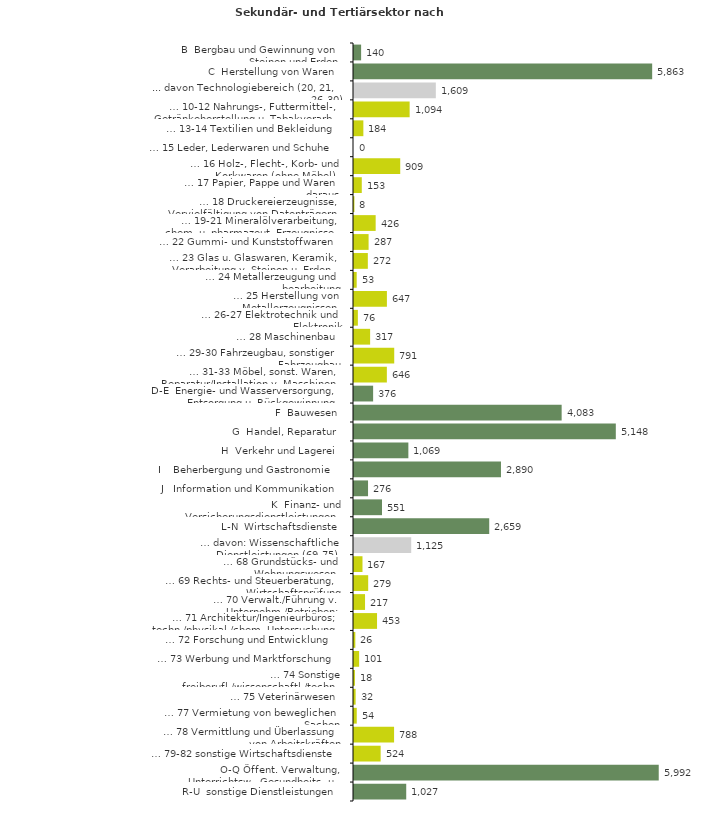
| Category | Series 0 |
|---|---|
| B  Bergbau und Gewinnung von Steinen und Erden | 140 |
| C  Herstellung von Waren | 5863 |
| ... davon Technologiebereich (20, 21, 26-30) | 1609 |
| … 10-12 Nahrungs-, Futtermittel-, Getränkeherstellung u. Tabakverarb. | 1094 |
| … 13-14 Textilien und Bekleidung | 184 |
| … 15 Leder, Lederwaren und Schuhe | 0 |
| … 16 Holz-, Flecht-, Korb- und Korkwaren (ohne Möbel)  | 909 |
| … 17 Papier, Pappe und Waren daraus  | 153 |
| … 18 Druckereierzeugnisse, Vervielfältigung von Datenträgern | 8 |
| … 19-21 Mineralölverarbeitung, chem. u. pharmazeut. Erzeugnisse | 426 |
| … 22 Gummi- und Kunststoffwaren | 287 |
| … 23 Glas u. Glaswaren, Keramik, Verarbeitung v. Steinen u. Erden  | 272 |
| … 24 Metallerzeugung und -bearbeitung | 53 |
| … 25 Herstellung von Metallerzeugnissen  | 647 |
| … 26-27 Elektrotechnik und Elektronik | 76 |
| … 28 Maschinenbau | 317 |
| … 29-30 Fahrzeugbau, sonstiger Fahrzeugbau | 791 |
| … 31-33 Möbel, sonst. Waren, Reparatur/Installation v. Maschinen | 646 |
| D-E  Energie- und Wasserversorgung, Entsorgung u. Rückgewinnung | 376 |
| F  Bauwesen | 4083 |
| G  Handel, Reparatur | 5148 |
| H  Verkehr und Lagerei | 1069 |
| I    Beherbergung und Gastronomie | 2890 |
| J   Information und Kommunikation | 276 |
| K  Finanz- und Versicherungsdienstleistungen | 551 |
| L-N  Wirtschaftsdienste | 2659 |
| … davon: Wissenschaftliche Dienstleistungen (69-75) | 1125 |
| … 68 Grundstücks- und Wohnungswesen  | 167 |
| … 69 Rechts- und Steuerberatung, Wirtschaftsprüfung | 279 |
| … 70 Verwalt./Führung v. Unternehm./Betrieben; Unternehmensberat. | 217 |
| … 71 Architektur/Ingenieurbüros; techn./physikal./chem. Untersuchung | 453 |
| … 72 Forschung und Entwicklung  | 26 |
| … 73 Werbung und Marktforschung | 101 |
| … 74 Sonstige freiberufl./wissenschaftl./techn. Tätigkeiten | 18 |
| … 75 Veterinärwesen | 32 |
| … 77 Vermietung von beweglichen Sachen  | 54 |
| … 78 Vermittlung und Überlassung von Arbeitskräften | 788 |
| … 79-82 sonstige Wirtschaftsdienste | 524 |
| O-Q Öffent. Verwaltung, Unterrichtsw., Gesundheits- u. Sozialwesen | 5992 |
| R-U  sonstige Dienstleistungen | 1027 |